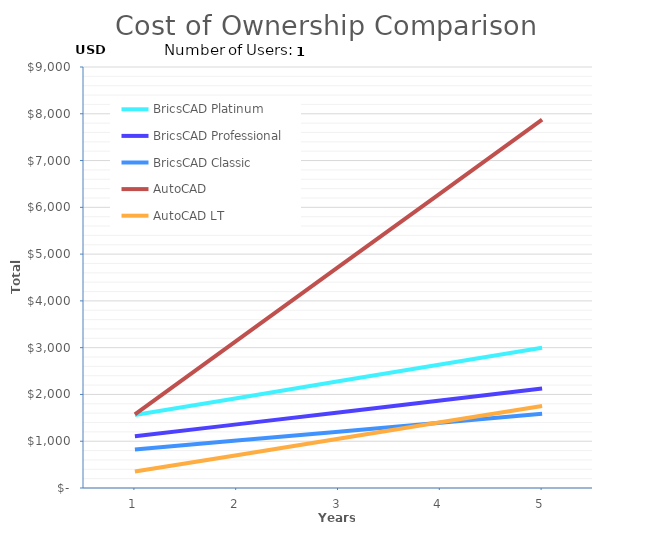
| Category |  BricsCAD Platinum  |  BricsCAD Professional  | BricsCAD Classic |  AutoCAD  |  AutoCAD LT  |
|---|---|---|---|---|---|
| 1.0 | 1560 | 1105 | 825 | 1575 | 351 |
| 2.0 | 1920 | 1360 | 1015 | 3150 | 702 |
| 3.0 | 2280 | 1615 | 1205 | 4725 | 1053 |
| 4.0 | 2640 | 1870 | 1395 | 6300 | 1404 |
| 5.0 | 3000 | 2125 | 1585 | 7875 | 1755 |